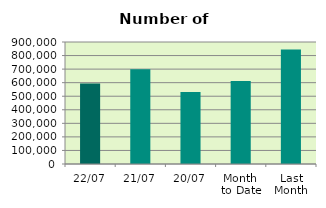
| Category | Series 0 |
|---|---|
| 22/07 | 593368 |
| 21/07 | 698948 |
| 20/07 | 531592 |
| Month 
to Date | 612347.5 |
| Last
Month | 844726.818 |